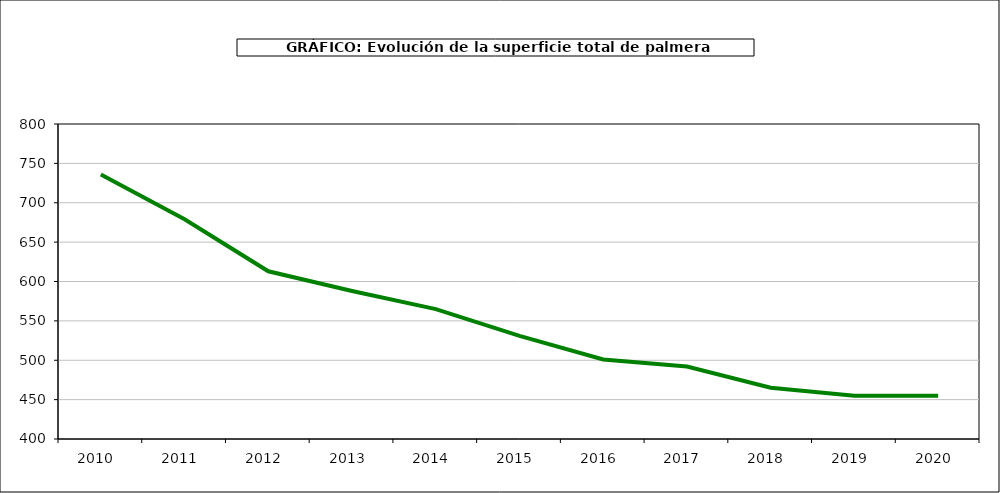
| Category | superficie kiwi |
|---|---|
| 2010.0 | 736 |
| 2011.0 | 679 |
| 2012.0 | 613 |
| 2013.0 | 588 |
| 2014.0 | 565 |
| 2015.0 | 531 |
| 2016.0 | 501 |
| 2017.0 | 492 |
| 2018.0 | 465 |
| 2019.0 | 455 |
| 2020.0 | 455 |